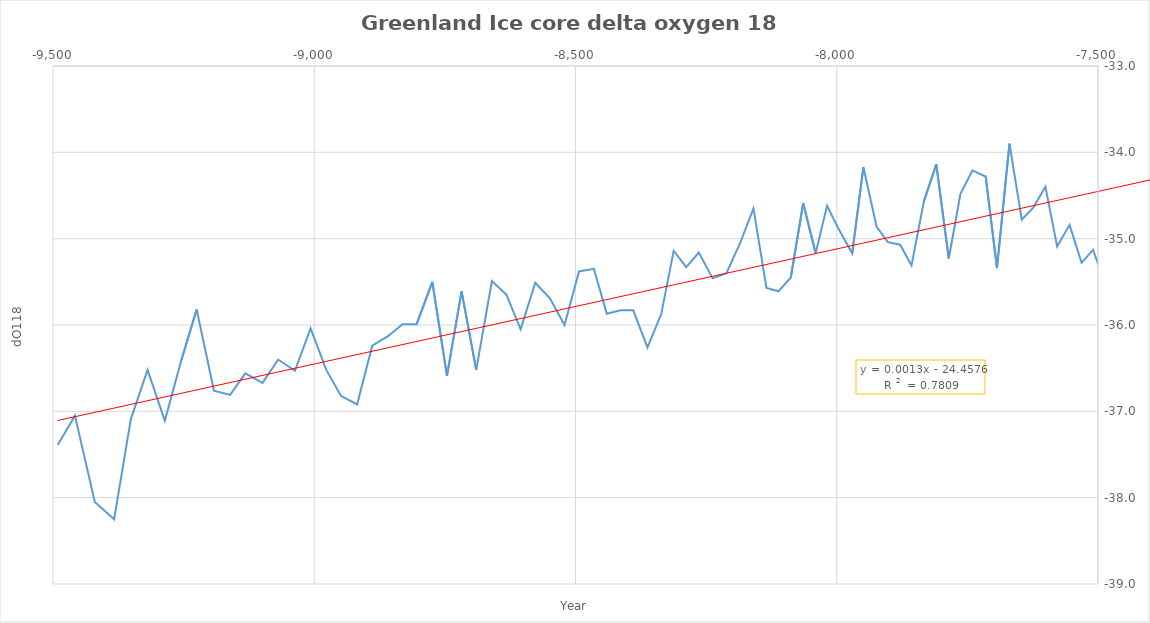
| Category | Series 0 |
|---|---|
| -7340.17 | -33.94 |
| -7362.83 | -34.19 |
| -7381.83 | -34.4 |
| -7403.780000000001 | -34.15 |
| -7424.0 | -34.89 |
| -7446.43 | -34.39 |
| -7467.700000000001 | -34.92 |
| -7488.780000000001 | -35.48 |
| -7509.4400000000005 | -35.13 |
| -7531.379999999999 | -35.28 |
| -7554.4400000000005 | -34.84 |
| -7578.200000000001 | -35.09 |
| -7600.629999999999 | -34.4 |
| -7623.790000000001 | -34.64 |
| -7645.889999999999 | -34.78 |
| -7669.450000000001 | -33.9 |
| -7693.32 | -35.34 |
| -7714.950000000001 | -34.28 |
| -7740.41 | -34.21 |
| -7763.219999999999 | -34.48 |
| -7785.620000000001 | -35.23 |
| -7809.5 | -34.14 |
| -7833.3099999999995 | -34.57 |
| -7856.889999999999 | -35.31 |
| -7878.67 | -35.07 |
| -7902.23 | -35.04 |
| -7923.889999999999 | -34.86 |
| -7949.049999999999 | -34.17 |
| -7970.42 | -35.17 |
| -7995.360000000001 | -34.9 |
| -8018.58 | -34.62 |
| -8040.42 | -35.17 |
| -8064.200000000001 | -34.59 |
| -8088.0 | -35.45 |
| -8111.5 | -35.61 |
| -8134.5 | -35.57 |
| -8159.4 | -34.65 |
| -8184.799999999999 | -35.05 |
| -8211.1 | -35.4 |
| -8237.5 | -35.46 |
| -8264.1 | -35.16 |
| -8288.1 | -35.33 |
| -8312.1 | -35.14 |
| -8335.8 | -35.87 |
| -8362.2 | -36.26 |
| -8389.5 | -35.83 |
| -8413.6 | -35.83 |
| -8440.0 | -35.87 |
| -8464.8 | -35.35 |
| -8493.3 | -35.38 |
| -8521.0 | -36 |
| -8549.0 | -35.69 |
| -8577.0 | -35.51 |
| -8605.0 | -36.05 |
| -8632.0 | -35.65 |
| -8660.0 | -35.49 |
| -8690.0 | -36.52 |
| -8718.0 | -35.61 |
| -8746.0 | -36.59 |
| -8774.0 | -35.5 |
| -8804.0 | -35.99 |
| -8831.0 | -35.99 |
| -8859.0 | -36.13 |
| -8889.0 | -36.24 |
| -8918.0 | -36.92 |
| -8949.0 | -36.82 |
| -8977.0 | -36.52 |
| -9007.0 | -36.04 |
| -9037.0 | -36.53 |
| -9069.0 | -36.4 |
| -9099.0 | -36.67 |
| -9132.0 | -36.56 |
| -9161.0 | -36.81 |
| -9192.0 | -36.76 |
| -9225.0 | -35.82 |
| -9255.0 | -36.42 |
| -9286.0 | -37.11 |
| -9319.0 | -36.52 |
| -9351.0 | -37.09 |
| -9383.0 | -38.25 |
| -9420.0 | -38.05 |
| -9458.0 | -37.05 |
| -9491.0 | -37.39 |